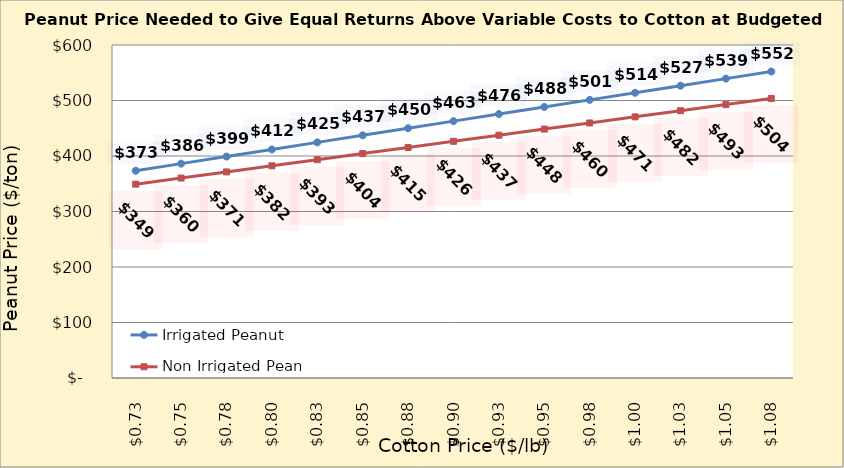
| Category | Irrigated Peanut | Non Irrigated Peanut |
|---|---|---|
| 0.7249999999999999 | 373.474 | 349.232 |
| 0.7499999999999999 | 386.24 | 360.262 |
| 0.7749999999999999 | 399.006 | 371.291 |
| 0.7999999999999999 | 411.772 | 382.321 |
| 0.825 | 424.538 | 393.35 |
| 0.85 | 437.304 | 404.379 |
| 0.875 | 450.07 | 415.409 |
| 0.9 | 462.836 | 426.438 |
| 0.925 | 475.602 | 437.468 |
| 0.9500000000000001 | 488.368 | 448.497 |
| 0.9750000000000001 | 501.134 | 459.526 |
| 1.0 | 513.9 | 470.556 |
| 1.025 | 526.666 | 481.585 |
| 1.0499999999999998 | 539.432 | 492.615 |
| 1.0749999999999997 | 552.198 | 503.644 |